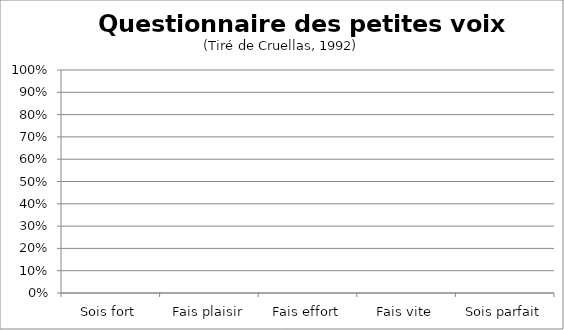
| Category | Series 0 |
|---|---|
| Sois fort | 0 |
| Fais plaisir | 0 |
| Fais effort | 0 |
| Fais vite | 0 |
| Sois parfait | 0 |